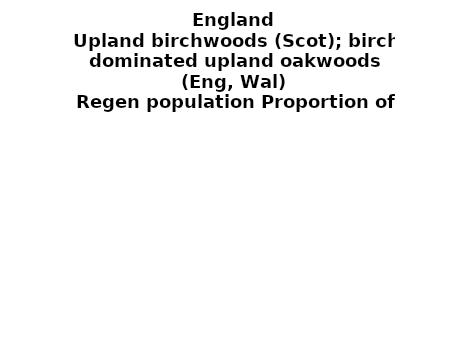
| Category | Upland birchwoods (Scot); birch dominated upland oakwoods (Eng, Wal) |
|---|---|
| None | 0.028 |
| Seedlings only | 0 |
| Seedlings, saplings only | 0.053 |
| Seedlings, saplings, <7 cm trees | 0.316 |
| Saplings only | 0.17 |
| <7 cm trees, seedlings only | 0 |
| <7 cm trees, saplings only | 0.353 |
| <7 cm Trees only | 0.08 |